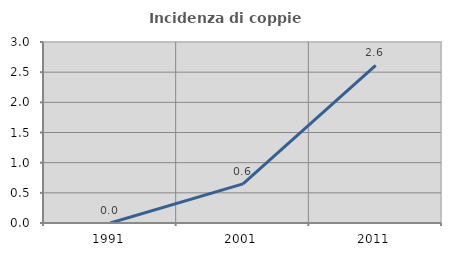
| Category | Incidenza di coppie miste |
|---|---|
| 1991.0 | 0 |
| 2001.0 | 0.649 |
| 2011.0 | 2.614 |